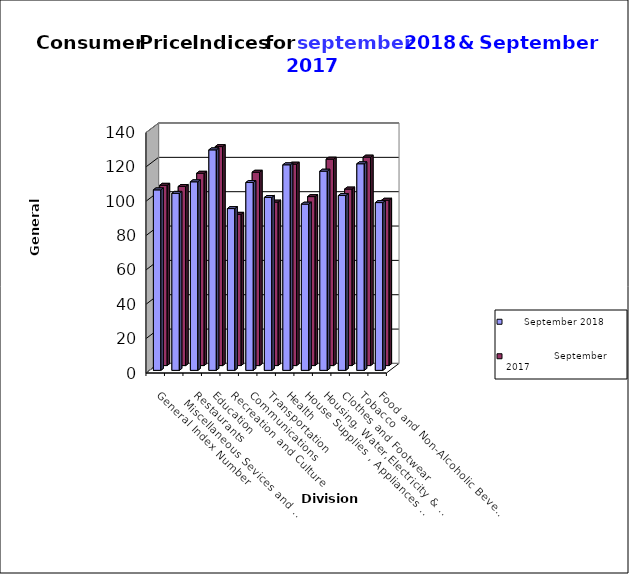
| Category |       September 2018   |                 September  2017 |
|---|---|---|
| Food and Non-Alcoholic Beverages | 97.7 | 96.3 |
| Tobacco | 120.3 | 121.4 |
| Clothes and Footwear | 101.8 | 102.8 |
| Housing, Water,Electricity & LPG  | 116 | 120.2 |
| House Supplies , Appliances & Maintenance | 96.8 | 98.4 |
| Health | 119.7 | 117.3 |
| Transportation | 100.7 | 95.2 |
| Communications | 109.4 | 112.6 |
| Recreation and Culture | 94.2 | 88.1 |
| Education | 128.4 | 127.5 |
| Restaurants | 109.8 | 112 |
|    Miscellaneous Sevices and Goods | 103.1 | 104.3 |
| General Index Number | 105.1 | 105 |